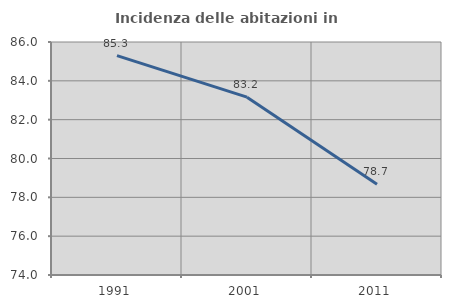
| Category | Incidenza delle abitazioni in proprietà  |
|---|---|
| 1991.0 | 85.297 |
| 2001.0 | 83.158 |
| 2011.0 | 78.673 |